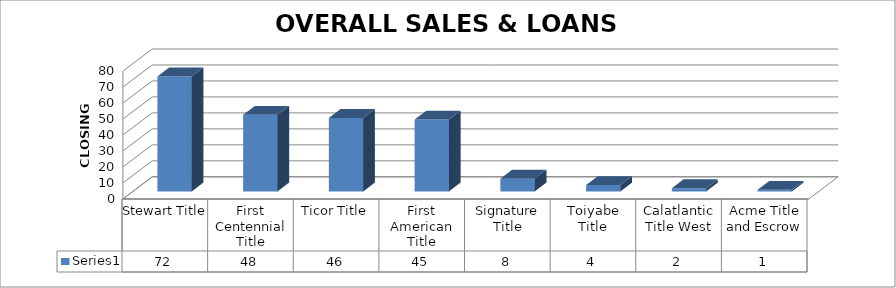
| Category | Series 0 |
|---|---|
| Stewart Title | 72 |
| First Centennial Title | 48 |
| Ticor Title | 46 |
| First American Title | 45 |
| Signature Title | 8 |
| Toiyabe Title | 4 |
| Calatlantic Title West | 2 |
| Acme Title and Escrow | 1 |